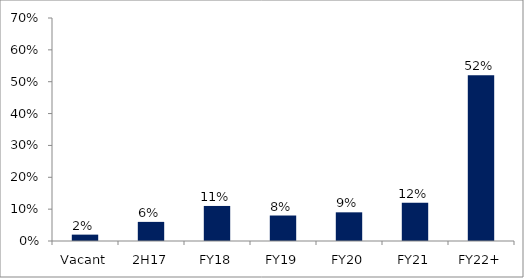
| Category | Series 0 |
|---|---|
| Vacant | 0.02 |
| 2H17 | 0.06 |
| FY18 | 0.11 |
| FY19 | 0.08 |
| FY20 | 0.09 |
| FY21 | 0.12 |
| FY22+ | 0.52 |